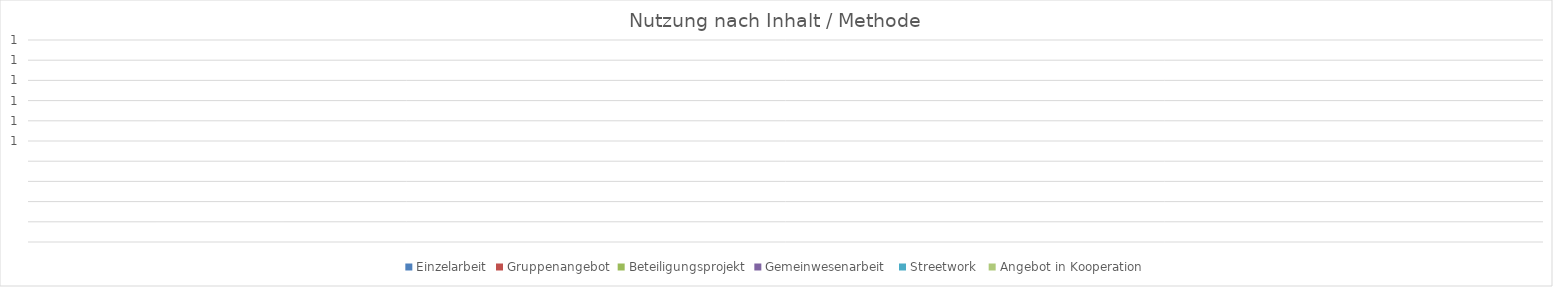
| Category | Einzelarbeit | Gruppenangebot | Beteiligungsprojekt | Gemeinwesenarbeit  | Streetwork  | Angebot in Kooperation |
|---|---|---|---|---|---|---|
| 0 | 0 | 0 | 0 | 0 | 0 | 0 |